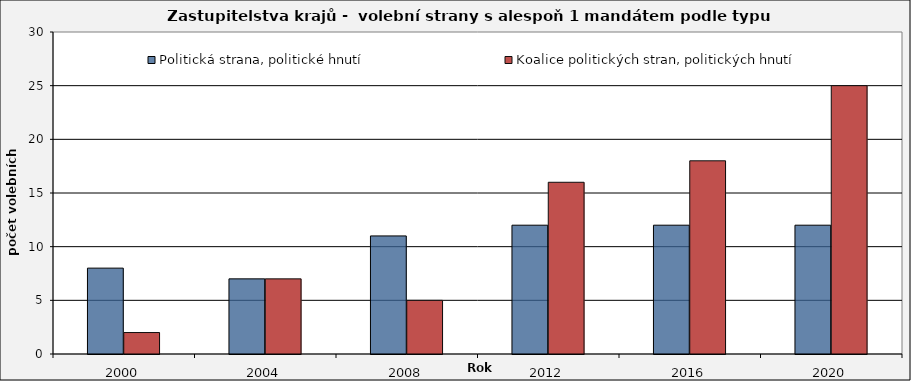
| Category | Politická strana, politické hnutí  | Koalice politických stran, politických hnutí |
|---|---|---|
| 2000.0 | 8 | 2 |
| 2004.0 | 7 | 7 |
| 2008.0 | 11 | 5 |
| 2012.0 | 12 | 16 |
| 2016.0 | 12 | 18 |
| 2020.0 | 12 | 25 |